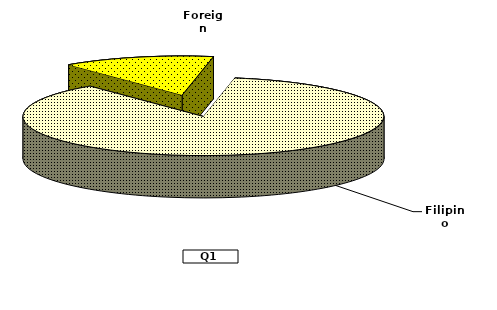
| Category | Series 0 |
|---|---|
| Filipino | 86.4 |
| Foreign | 13.6 |